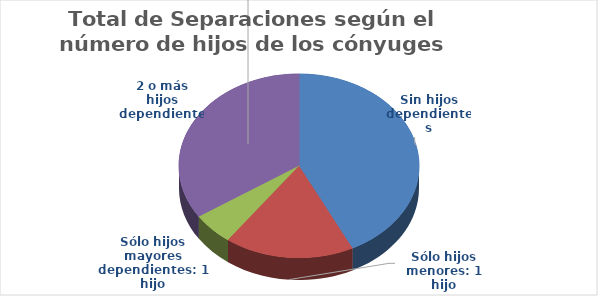
| Category | Series 0 |
|---|---|
| Sin hijos dependientes | 1184 |
| Sólo hijos menores: 1 hijo | 483 |
| Sólo hijos mayores dependientes: 1 hijo | 156 |
| 2 o más hijos dependientes | 952 |